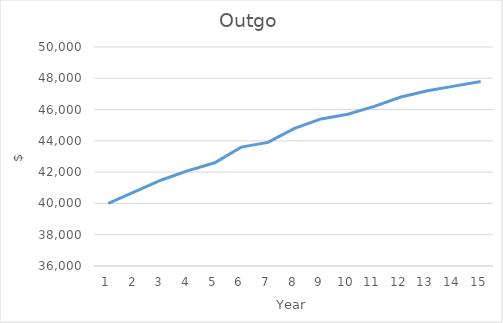
| Category | Series 0 |
|---|---|
| 0 | 40000 |
| 1 | 40750 |
| 2 | 41500 |
| 3 | 42100 |
| 4 | 42600 |
| 5 | 43600 |
| 6 | 43900 |
| 7 | 44800 |
| 8 | 45400 |
| 9 | 45700 |
| 10 | 46200 |
| 11 | 46800 |
| 12 | 47200 |
| 13 | 47500 |
| 14 | 47800 |